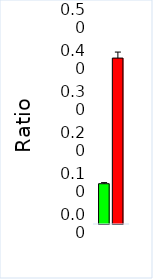
| Category | Control | ASD |
|---|---|---|
| Cas7:
MLTN | 0.098 | 0.405 |